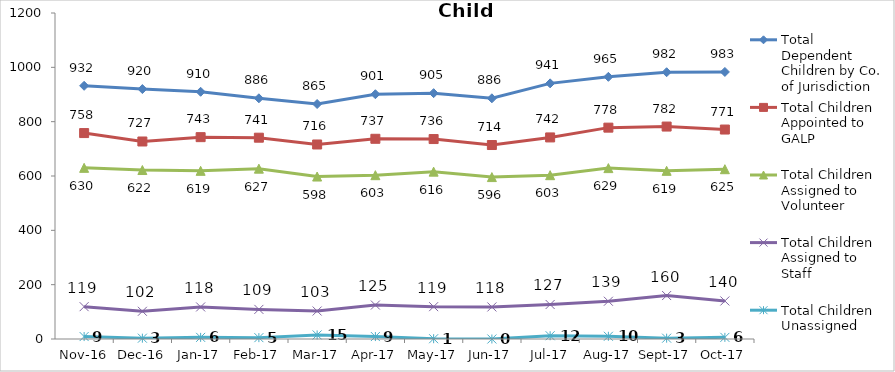
| Category | Total Dependent Children by Co. of Jurisdiction | Total Children Appointed to GALP | Total Children Assigned to Volunteer | Total Children Assigned to Staff | Total Children Unassigned |
|---|---|---|---|---|---|
| 2016-11-01 | 932 | 758 | 630 | 119 | 9 |
| 2016-12-01 | 920 | 727 | 622 | 102 | 3 |
| 2017-01-01 | 910 | 743 | 619 | 118 | 6 |
| 2017-02-01 | 886 | 741 | 627 | 109 | 5 |
| 2017-03-01 | 865 | 716 | 598 | 103 | 15 |
| 2017-04-01 | 901 | 737 | 603 | 125 | 9 |
| 2017-05-01 | 905 | 736 | 616 | 119 | 1 |
| 2017-06-01 | 886 | 714 | 596 | 118 | 0 |
| 2017-07-01 | 941 | 742 | 603 | 127 | 12 |
| 2017-08-01 | 965 | 778 | 629 | 139 | 10 |
| 2017-09-01 | 982 | 782 | 619 | 160 | 3 |
| 2017-10-01 | 983 | 771 | 625 | 140 | 6 |